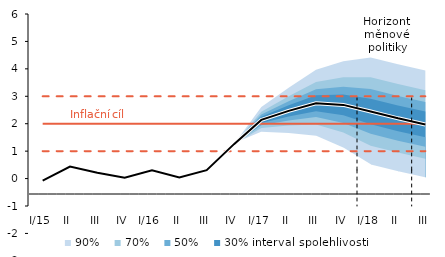
| Category | Inflation Target | Inflation Target - lower bound | Inflation Target - upper bound | linka | Střed předpovědi |
|---|---|---|---|---|---|
| I/15 | 2 | 1 | 3 | -0.076 | -0.076 |
| II | 2 | 1 | 3 | 0.439 | 0.439 |
| III | 2 | 1 | 3 | 0.212 | 0.212 |
| IV | 2 | 1 | 3 | 0.028 | 0.028 |
| I/16 | 2 | 1 | 3 | 0.305 | 0.305 |
| II | 2 | 1 | 3 | 0.039 | 0.039 |
| III | 2 | 1 | 3 | 0.305 | 0.305 |
| IV | 2 | 1 | 3 | 1.256 | 1.256 |
| I/17 | 2 | 1 | 3 | 2.139 | 2.139 |
| II | 2 | 1 | 3 | 2.468 | 2.468 |
| III | 2 | 1 | 3 | 2.748 | 2.748 |
| IV | 2 | 1 | 3 | 2.686 | 2.686 |
| I/18 | 2 | 1 | 3 | 2.446 | 2.446 |
| II | 2 | 1 | 3 | 2.197 | 2.197 |
| III | 2 | 1 | 3 | 1.974 | 1.974 |